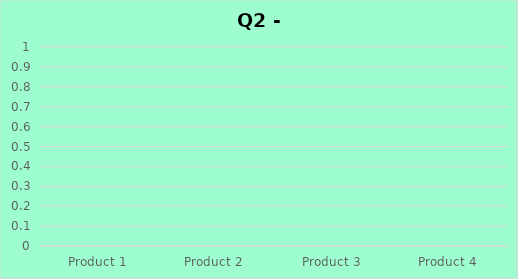
| Category | Series 0 |
|---|---|
| Product 1 | 0 |
| Product 2 | 0 |
| Product 3 | 0 |
| Product 4 | 0 |